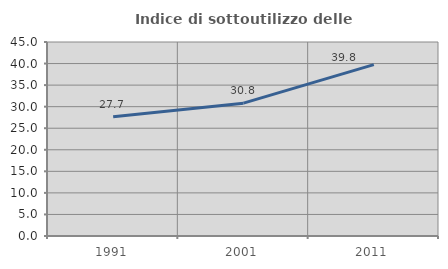
| Category | Indice di sottoutilizzo delle abitazioni  |
|---|---|
| 1991.0 | 27.675 |
| 2001.0 | 30.814 |
| 2011.0 | 39.759 |